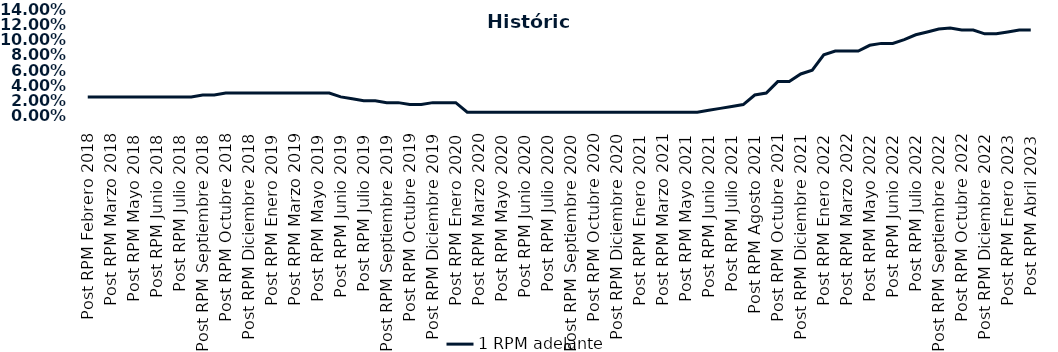
| Category | 1 RPM adelante |
|---|---|
| Post RPM Febrero 2018 | 0.025 |
| Pre RPM Marzo 2018 | 0.025 |
| Post RPM Marzo 2018 | 0.025 |
| Pre RPM Mayo 2018 | 0.025 |
| Post RPM Mayo 2018 | 0.025 |
| Pre RPM Junio 2018 | 0.025 |
| Post RPM Junio 2018 | 0.025 |
| Pre RPM Julio 2018 | 0.025 |
| Post RPM Julio 2018 | 0.025 |
| Pre RPM Septiembre 2018 | 0.025 |
| Post RPM Septiembre 2018 | 0.028 |
| Pre RPM Octubre 2018 | 0.028 |
| Post RPM Octubre 2018 | 0.03 |
| Pre RPM Diciembre 2018 | 0.03 |
| Post RPM Diciembre 2018 | 0.03 |
| Pre RPM Enero 2019 | 0.03 |
| Post RPM Enero 2019 | 0.03 |
| Pre RPM Marzo 2019 | 0.03 |
| Post RPM Marzo 2019 | 0.03 |
| Pre RPM Mayo 2019 | 0.03 |
| Post RPM Mayo 2019 | 0.03 |
| Pre RPM Junio 2019 | 0.03 |
| Post RPM Junio 2019 | 0.025 |
| Pre RPM Julio 2019 | 0.022 |
| Post RPM Julio 2019 | 0.02 |
| Pre RPM Septiembre 2019 | 0.02 |
| Post RPM Septiembre 2019 | 0.018 |
| Pre RPM Octubre 2019 | 0.018 |
| Post RPM Octubre 2019 | 0.015 |
| Pre RPM Diciembre 2019 | 0.015 |
| Post RPM Diciembre 2019 | 0.018 |
| Pre RPM Enero 2020 | 0.018 |
| Post RPM Enero 2020 | 0.018 |
| Pre RPM Marzo 2020 | 0.005 |
| Post RPM Marzo 2020 | 0.005 |
| Pre RPM Mayo 2020 | 0.005 |
| Post RPM Mayo 2020 | 0.005 |
| Pre RPM Junio 2020 | 0.005 |
| Post RPM Junio 2020 | 0.005 |
| Pre RPM Julio 2020 | 0.005 |
| Post RPM Julio 2020 | 0.005 |
| Pre RPM Septiembre 2020 | 0.005 |
| Post RPM Septiembre 2020 | 0.005 |
| Pre RPM Octubre 2020 | 0.005 |
| Post RPM Octubre 2020 | 0.005 |
| Pre RPM Diciembre 2020 | 0.005 |
| Post RPM Diciembre 2020 | 0.005 |
| Pre RPM Enero 2021 | 0.005 |
| Post RPM Enero 2021 | 0.005 |
| Pre RPM Marzo 2021 | 0.005 |
| Post RPM Marzo 2021 | 0.005 |
| Pre RPM Mayo 2021 | 0.005 |
| Post RPM Mayo 2021 | 0.005 |
| Pre RPM Junio 2021 | 0.005 |
| Post RPM Junio 2021 | 0.008 |
| Pre RPM Julio 2021 | 0.01 |
| Post RPM Julio 2021 | 0.012 |
| Pre RPM Agosto 2021 | 0.015 |
| Post RPM Agosto 2021 | 0.028 |
| Pre RPM Octubre 2021 | 0.03 |
| Post RPM Octubre 2021 | 0.045 |
| Pre RPM Diciembre 2021 | 0.045 |
| Post RPM Diciembre 2021 | 0.055 |
| Pre RPM Enero 2022 | 0.06 |
| Post RPM Enero 2022 | 0.08 |
| Pre RPM Marzo 2022 | 0.085 |
| Post RPM Marzo 2022 | 0.085 |
| Pre RPM Mayo 2022 | 0.085 |
| Post RPM Mayo 2022 | 0.092 |
| Pre RPM Junio 2022 | 0.095 |
| Post RPM Junio 2022 | 0.095 |
| Pre RPM Julio 2022 | 0.1 |
| Post RPM Julio 2022 | 0.106 |
| Pre RPM Septiembre 2022 | 0.11 |
| Post RPM Septiembre 2022 | 0.114 |
| Pre RPM Octubre 2022 | 0.115 |
| Post RPM Octubre 2022 | 0.112 |
| Pre RPM Diciembre 2022 | 0.112 |
| Post RPM Diciembre 2022 | 0.108 |
| Pre RPM Enero 2023 | 0.108 |
| Post RPM Enero 2023 | 0.11 |
| Pre RPM Abril 2023 | 0.112 |
| Post RPM Abril 2023 | 0.112 |